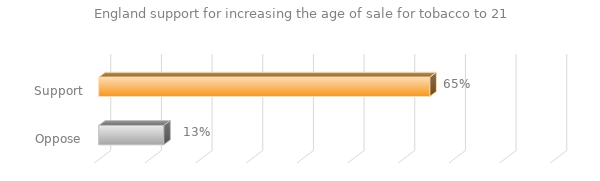
| Category | England support for increasing the age of sale for tobacco to 21 |
|---|---|
| Support | 0.654 |
| Oppose | 0.128 |